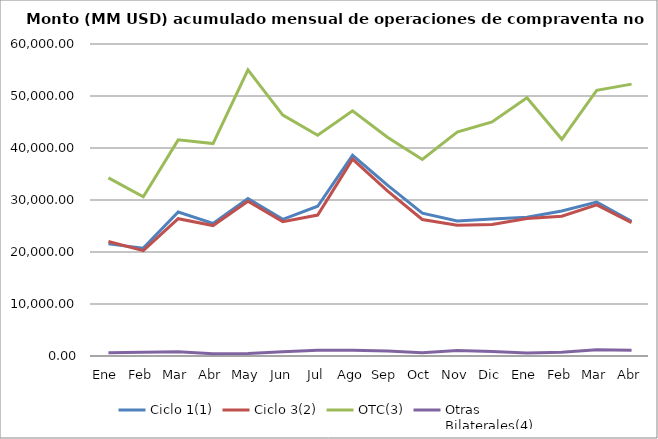
| Category | Ciclo 1(1) | Ciclo 3(2) | OTC(3) | Otras
Bilaterales(4) |
|---|---|---|---|---|
| Ene | 21560.845 | 22006.263 | 34254.398 | 624.056 |
| Feb | 20737.718 | 20259.785 | 30608.69 | 712.264 |
| Mar | 27689.104 | 26406.62 | 41565.587 | 816.585 |
| Abr | 25498.246 | 25078.47 | 40852.33 | 436.254 |
| May | 30280.552 | 29764.507 | 55013.217 | 477.268 |
| Jun | 26273.456 | 25834.982 | 46322.278 | 822.103 |
| Jul | 28792.81 | 27110.407 | 42437.363 | 1120.336 |
| Ago | 38596.016 | 37859.307 | 47136.271 | 1125.276 |
| Sep | 32864.424 | 31763.783 | 42068.964 | 961.025 |
| Oct | 27455.978 | 26253.656 | 37797.763 | 641.922 |
| Nov | 25962.062 | 25132.899 | 43076.937 | 1073.553 |
| Dic | 26367.07 | 25279.098 | 45022.478 | 878.171 |
| Ene | 26687.919 | 26451.759 | 49648.745 | 557.298 |
| Feb | 27881.584 | 26876.104 | 41680.35 | 743.398 |
| Mar | 29614.61 | 29066.765 | 51077.62 | 1203.543 |
| Abr | 25919.259 | 25655.719 | 52288.227 | 1109.366 |